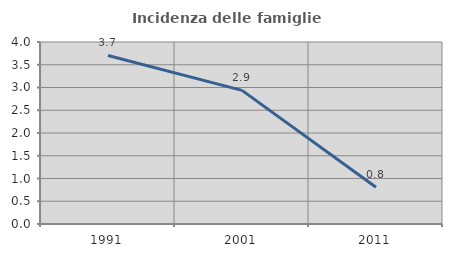
| Category | Incidenza delle famiglie numerose |
|---|---|
| 1991.0 | 3.704 |
| 2001.0 | 2.936 |
| 2011.0 | 0.809 |